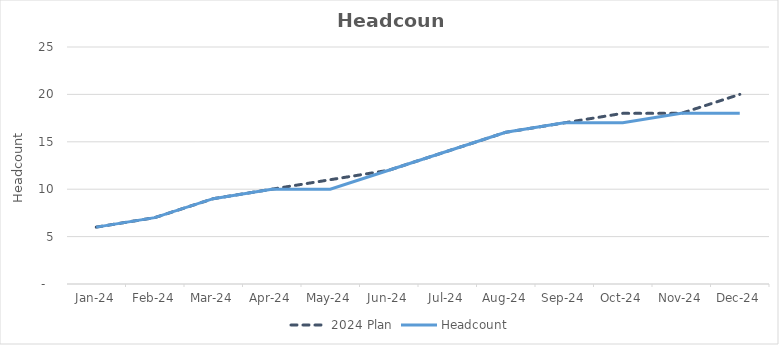
| Category | 2024 Plan | Headcount |
|---|---|---|
| 2024-01-31 | 6 | 6 |
| 2024-02-29 | 7 | 7 |
| 2024-03-31 | 9 | 9 |
| 2024-04-30 | 10 | 10 |
| 2024-05-31 | 11 | 10 |
| 2024-06-30 | 12 | 12 |
| 2024-07-31 | 14 | 14 |
| 2024-08-31 | 16 | 16 |
| 2024-09-30 | 17 | 17 |
| 2024-10-31 | 18 | 17 |
| 2024-11-30 | 18 | 18 |
| 2024-12-31 | 20 | 18 |